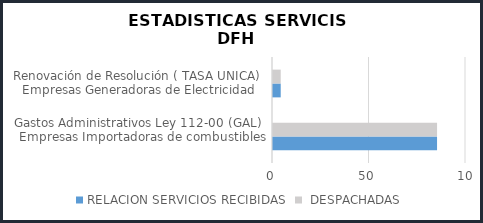
| Category | RELACION SERVICIOS RECIBIDAS | RELACION SERVICIOS DESPACHADAS |
|---|---|---|
| Gastos Administrativos Ley 112-00 (GAL)   Empresas Importadoras de combustibles | 85 | 85 |
| Renovación de Resolución ( TASA UNICA)  Empresas Generadoras de Electricidad | 4 | 4 |